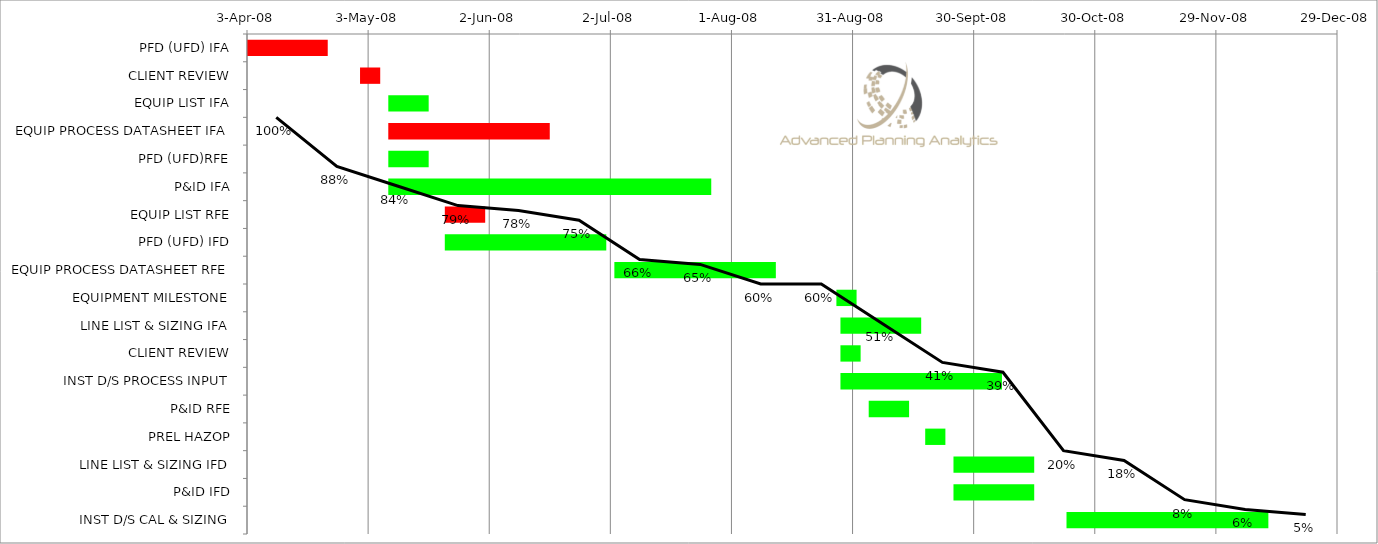
| Category | Start | Duration |
|---|---|---|
| PFD (UFD) IFA | 2008-04-03 | 20 |
| CLIENT REVIEW | 2008-05-01 | 5 |
| EQUIP LIST IFA | 2008-05-08 | 10 |
| EQUIP PROCESS DATASHEET IFA | 2008-05-08 | 40 |
| PFD (UFD)RFE | 2008-05-08 | 10 |
| P&ID IFA | 2008-05-08 | 80 |
| EQUIP LIST RFE | 2008-05-22 | 10 |
| PFD (UFD) IFD | 2008-05-22 | 40 |
| EQUIP PROCESS DATASHEET RFE | 2008-07-03 | 40 |
| EQUIPMENT MILESTONE | 2008-08-27 | 5 |
| LINE LIST & SIZING IFA | 2008-08-28 | 20 |
| CLIENT REVIEW | 2008-08-28 | 5 |
| INST D/S PROCESS INPUT | 2008-08-28 | 40 |
| P&ID RFE | 2008-09-04 | 10 |
| PREL HAZOP | 2008-09-18 | 5 |
| LINE LIST & SIZING IFD | 2008-09-25 | 20 |
| P&ID IFD | 2008-09-25 | 20 |
| INST D/S CAL & SIZING | 2008-10-23 | 50 |